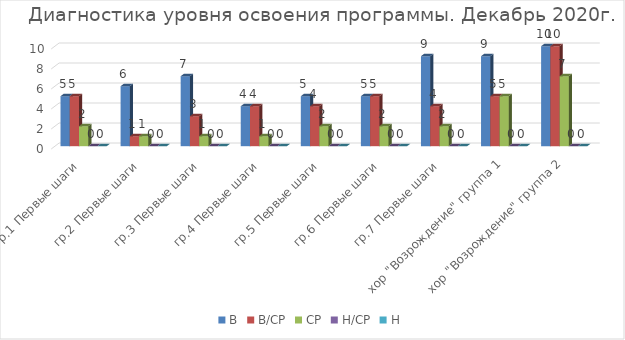
| Category | В | В/СР | СР | Н/СР | Н |
|---|---|---|---|---|---|
| гр.1 Первые шаги | 5 | 5 | 2 | 0 | 0 |
| гр.2 Первые шаги | 6 | 1 | 1 | 0 | 0 |
| гр.3 Первые шаги | 7 | 3 | 1 | 0 | 0 |
| гр.4 Первые шаги | 4 | 4 | 1 | 0 | 0 |
| гр.5 Первые шаги | 5 | 4 | 2 | 0 | 0 |
| гр.6 Первые шаги | 5 | 5 | 2 | 0 | 0 |
| гр.7 Первые шаги | 9 | 4 | 2 | 0 | 0 |
| хор "Возрождение" группа 1 | 9 | 5 | 5 | 0 | 0 |
| хор "Возрождение" группа 2 | 10 | 10 | 7 | 0 | 0 |